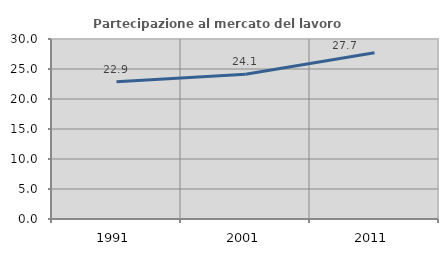
| Category | Partecipazione al mercato del lavoro  femminile |
|---|---|
| 1991.0 | 22.895 |
| 2001.0 | 24.138 |
| 2011.0 | 27.696 |